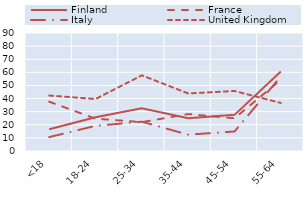
| Category | Finland | France | Italy | United Kingdom |
|---|---|---|---|---|
| <18 | 16.59 | 37.63 | 10.6 | 42.32 |
| 18-24 | 25.74 | 24.65 | 19.18 | 39.66 |
| 25-34 | 32.58 | 22.02 | 22.35 | 57.7 |
| 35-44 | 24.91 | 28.16 | 12.46 | 43.91 |
| 45-54 | 27.56 | 24.97 | 14.88 | 45.75 |
| 55-64 | 60.68 | 54.35 | 56.86 | 36.65 |